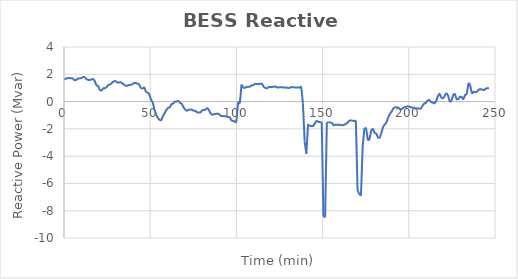
| Category | BESS Reactive Power |
|---|---|
| 0.0 | 1.624 |
| 0.99 | 1.675 |
| 1.98 | 1.709 |
| 2.97 | 1.732 |
| 3.96 | 1.702 |
| 4.95 | 1.703 |
| 5.94 | 1.582 |
| 6.93 | 1.582 |
| 7.92 | 1.669 |
| 8.91 | 1.699 |
| 9.9 | 1.712 |
| 10.89 | 1.79 |
| 11.88 | 1.804 |
| 12.87 | 1.662 |
| 13.86 | 1.601 |
| 14.85 | 1.571 |
| 15.84 | 1.617 |
| 16.83 | 1.645 |
| 17.82 | 1.51 |
| 18.81 | 1.196 |
| 19.8 | 1.139 |
| 20.79 | 0.863 |
| 21.78 | 0.823 |
| 22.77 | 0.968 |
| 23.76 | 0.983 |
| 24.75 | 1.068 |
| 25.74 | 1.224 |
| 26.73 | 1.252 |
| 27.72 | 1.362 |
| 28.71 | 1.459 |
| 29.7 | 1.506 |
| 30.69 | 1.41 |
| 31.68 | 1.388 |
| 32.67 | 1.426 |
| 33.66 | 1.336 |
| 34.65 | 1.274 |
| 35.64 | 1.168 |
| 36.63 | 1.161 |
| 37.62 | 1.208 |
| 38.61 | 1.226 |
| 39.6 | 1.261 |
| 40.59 | 1.353 |
| 41.58 | 1.366 |
| 42.57 | 1.315 |
| 43.56 | 1.258 |
| 44.55 | 1.007 |
| 45.54 | 0.961 |
| 46.53 | 1.024 |
| 47.52 | 0.738 |
| 48.51 | 0.65 |
| 49.5 | 0.528 |
| 50.49 | 0.138 |
| 51.48 | -0.087 |
| 52.47 | -0.588 |
| 53.46 | -0.95 |
| 54.45 | -1.198 |
| 55.44 | -1.338 |
| 56.43 | -1.351 |
| 57.42 | -1.045 |
| 58.41 | -0.842 |
| 59.4 | -0.612 |
| 60.39 | -0.463 |
| 61.38 | -0.41 |
| 62.37 | -0.19 |
| 63.36 | -0.148 |
| 64.35 | -0.006 |
| 65.34 | -0.001 |
| 66.33 | 0.043 |
| 67.32 | -0.092 |
| 68.31 | -0.176 |
| 69.3 | -0.41 |
| 70.29 | -0.579 |
| 71.28 | -0.671 |
| 72.27 | -0.6 |
| 73.26 | -0.586 |
| 74.25 | -0.599 |
| 75.24 | -0.672 |
| 76.23 | -0.684 |
| 77.22 | -0.791 |
| 78.21 | -0.797 |
| 79.2 | -0.785 |
| 80.19 | -0.637 |
| 81.18 | -0.621 |
| 82.17 | -0.575 |
| 83.16 | -0.48 |
| 84.15 | -0.648 |
| 85.14 | -0.883 |
| 86.13 | -0.962 |
| 87.12 | -0.922 |
| 88.11 | -0.897 |
| 89.1 | -0.887 |
| 90.09 | -0.932 |
| 91.08 | -1.056 |
| 92.07 | -1.056 |
| 93.06 | -1.082 |
| 94.05 | -1.087 |
| 95.04 | -1.131 |
| 96.03 | -1.147 |
| 97.02 | -1.353 |
| 98.01 | -1.428 |
| 99.0 | -1.442 |
| 99.99 | -1.426 |
| 100.98 | -0.112 |
| 101.97 | -0.062 |
| 102.96 | 1.251 |
| 103.95 | 1.021 |
| 104.94 | 1.005 |
| 105.93 | 1.074 |
| 106.92 | 1.088 |
| 107.91 | 1.099 |
| 108.9 | 1.19 |
| 109.89 | 1.21 |
| 110.88 | 1.3 |
| 111.87 | 1.282 |
| 112.86 | 1.288 |
| 113.85 | 1.304 |
| 114.84 | 1.302 |
| 115.83 | 1.088 |
| 116.82 | 1.001 |
| 117.81 | 0.978 |
| 118.8 | 1.069 |
| 119.79 | 1.066 |
| 120.78 | 1.073 |
| 121.77 | 1.087 |
| 122.76 | 1.104 |
| 123.75 | 1.033 |
| 124.74 | 1.038 |
| 125.73 | 1.058 |
| 126.72 | 1.041 |
| 127.71 | 1.04 |
| 128.7 | 1.034 |
| 129.69 | 1.004 |
| 130.68 | 1.004 |
| 131.67 | 1.056 |
| 132.66 | 1.052 |
| 133.65 | 1.039 |
| 134.64 | 1.03 |
| 135.63 | 1.03 |
| 136.62 | 1.025 |
| 137.61 | 1.003 |
| 138.6 | -0.155 |
| 139.59 | -2.933 |
| 140.58 | -3.838 |
| 141.57 | -1.66 |
| 142.56 | -1.788 |
| 143.55 | -1.788 |
| 144.54 | -1.783 |
| 145.53 | -1.595 |
| 146.52 | -1.419 |
| 147.51 | -1.483 |
| 148.5 | -1.509 |
| 149.49 | -1.509 |
| 150.48 | -8.409 |
| 151.47 | -8.478 |
| 152.46 | -1.54 |
| 153.45 | -1.515 |
| 154.44 | -1.531 |
| 155.43 | -1.568 |
| 156.42 | -1.735 |
| 157.41 | -1.692 |
| 158.4 | -1.702 |
| 159.39 | -1.697 |
| 160.38 | -1.708 |
| 161.37 | -1.736 |
| 162.36 | -1.711 |
| 163.35 | -1.639 |
| 164.34 | -1.572 |
| 165.33 | -1.421 |
| 166.32 | -1.377 |
| 167.31 | -1.404 |
| 168.3 | -1.425 |
| 169.29 | -1.38 |
| 170.28 | -6.492 |
| 171.27 | -6.787 |
| 172.26 | -6.893 |
| 173.25 | -3.263 |
| 174.24 | -1.956 |
| 175.23 | -2.004 |
| 176.22 | -2.75 |
| 177.21 | -2.724 |
| 178.2 | -2.148 |
| 179.19 | -2.023 |
| 180.18 | -2.293 |
| 181.17 | -2.364 |
| 182.16 | -2.621 |
| 183.15 | -2.63 |
| 184.14 | -2.273 |
| 185.13 | -1.862 |
| 186.12 | -1.671 |
| 187.11 | -1.5 |
| 188.1 | -1.142 |
| 189.09 | -0.899 |
| 190.08 | -0.718 |
| 191.07 | -0.502 |
| 192.06 | -0.426 |
| 193.05 | -0.426 |
| 194.04 | -0.449 |
| 195.03 | -0.588 |
| 196.02 | -0.532 |
| 197.01 | -0.437 |
| 198.0 | -0.405 |
| 198.99 | -0.352 |
| 199.98 | -0.362 |
| 200.97 | -0.403 |
| 201.96 | -0.442 |
| 202.95 | -0.458 |
| 203.94 | -0.518 |
| 204.93 | -0.49 |
| 205.92 | -0.509 |
| 206.91 | -0.514 |
| 207.9 | -0.316 |
| 208.89 | -0.16 |
| 209.88 | -0.093 |
| 210.87 | 0.069 |
| 211.86 | 0.105 |
| 212.85 | -0.016 |
| 213.84 | -0.064 |
| 214.83 | -0.131 |
| 215.82 | 0.027 |
| 216.81 | 0.368 |
| 217.8 | 0.572 |
| 218.79 | 0.314 |
| 219.78 | 0.239 |
| 220.77 | 0.408 |
| 221.76 | 0.599 |
| 222.75 | 0.444 |
| 223.74 | 0.026 |
| 224.73 | 0.104 |
| 225.72 | 0.452 |
| 226.71 | 0.546 |
| 227.7 | 0.186 |
| 228.69 | 0.188 |
| 229.68 | 0.342 |
| 230.67 | 0.338 |
| 231.66 | 0.192 |
| 232.65 | 0.484 |
| 233.64 | 0.578 |
| 234.63 | 1.301 |
| 235.62 | 1.158 |
| 236.61 | 0.638 |
| 237.6 | 0.72 |
| 238.59 | 0.685 |
| 239.58 | 0.738 |
| 240.57 | 0.873 |
| 241.56 | 0.908 |
| 242.55 | 0.881 |
| 243.54 | 0.843 |
| 244.53 | 0.934 |
| 245.52 | 0.982 |
| 246.51 | 0.982 |